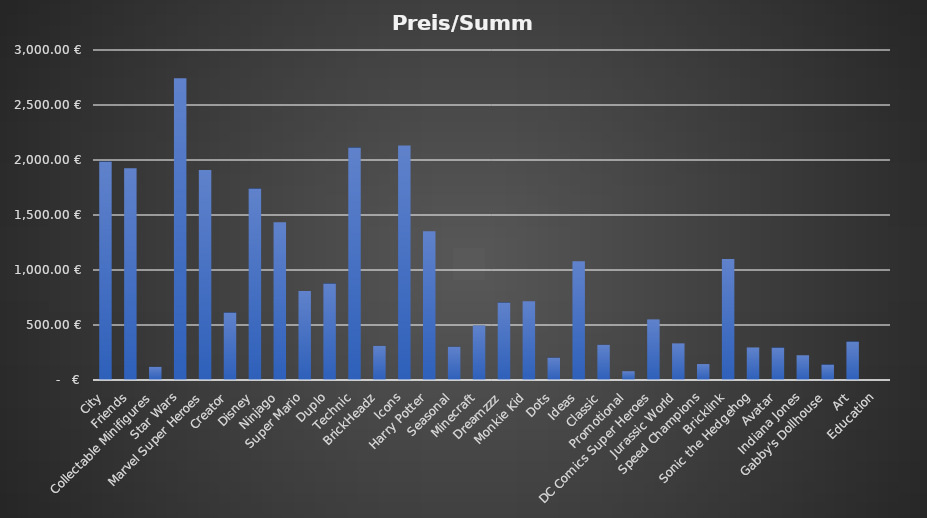
| Category | Preis/Summe |
|---|---|
| City | 1985.57 |
| Friends | 1924.63 |
| Collectable Minifigures | 119.7 |
| Star Wars | 2743.71 |
| Marvel Super Heroes | 1909.73 |
| Creator | 612.84 |
| Disney | 1740.77 |
| Ninjago | 1434.76 |
| Super Mario | 809.76 |
| Duplo | 876.81 |
| Technic | 2112.83 |
| BrickHeadz | 309.83 |
| Icons | 2132.88 |
| Harry Potter | 1352.85 |
| Seasonal | 301.9 |
| Minecraft | 494.89 |
| Dreamzzz | 703.89 |
| Monkie Kid | 715.91 |
| Dots | 202.91 |
| Ideas | 1079.93 |
| Classic | 319.93 |
| Promotional | 79.99 |
| DC Comics Super Heroes | 550.95 |
| Jurassic World | 332.95 |
| Speed Champions | 144.95 |
| Bricklink | 1099.95 |
| Sonic the Hedgehog | 295.95 |
| Avatar | 294.95 |
| Indiana Jones | 224.97 |
| Gabby's Dollhouse | 140.96 |
| Art | 349.97 |
| Education | 0 |